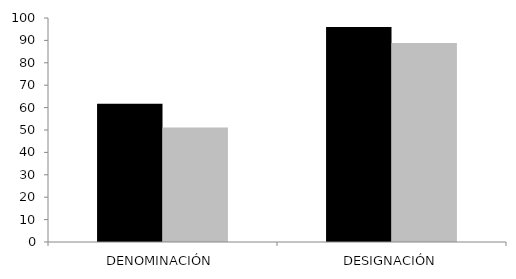
| Category | grupo control | grupo TEL |
|---|---|---|
| DENOMINACIÓN | 61.667 | 51.111 |
| DESIGNACIÓN | 96 | 88.889 |